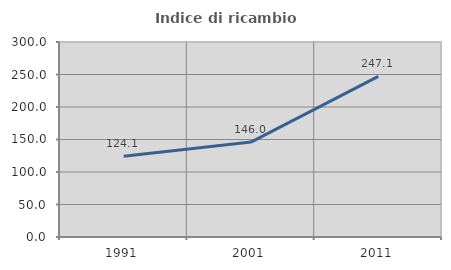
| Category | Indice di ricambio occupazionale  |
|---|---|
| 1991.0 | 124.138 |
| 2001.0 | 146 |
| 2011.0 | 247.126 |